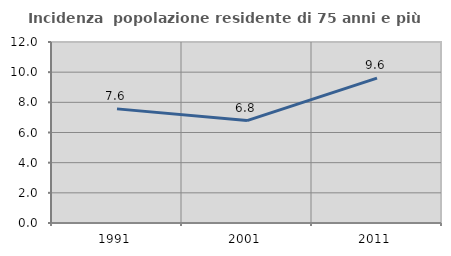
| Category | Incidenza  popolazione residente di 75 anni e più |
|---|---|
| 1991.0 | 7.566 |
| 2001.0 | 6.791 |
| 2011.0 | 9.602 |